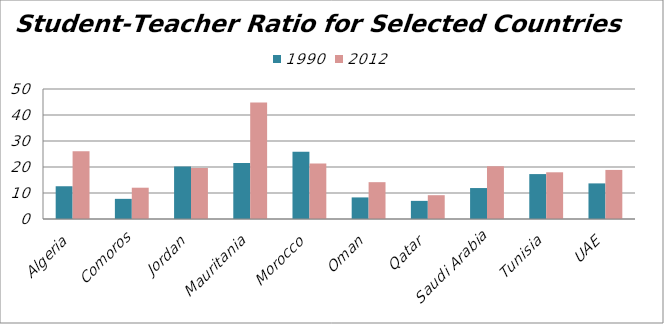
| Category | 1990 | 2012 |
|---|---|---|
| Algeria | 12.596 | 26.053 |
| Comoros | 7.75 | 12.035 |
| Jordan | 20.201 | 19.605 |
| Mauritania | 21.519 | 44.807 |
| Morocco | 25.822 | 21.371 |
| Oman | 8.301 | 14.164 |
| Qatar | 6.972 | 9.157 |
| Saudi Arabia | 11.905 | 20.289 |
| Tunisia | 17.275 | 17.965 |
| UAE | 13.695 | 18.874 |